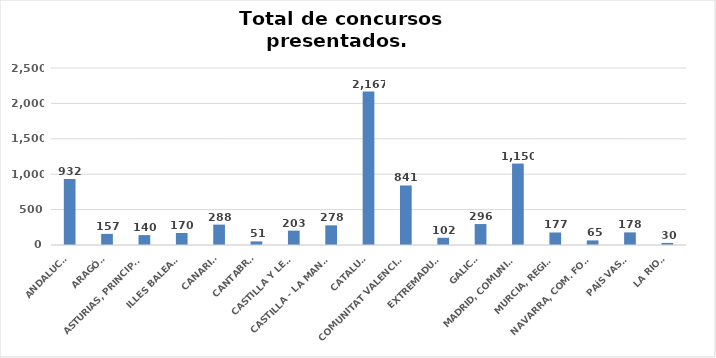
| Category | Series 0 |
|---|---|
| ANDALUCÍA | 932 |
| ARAGÓN | 157 |
| ASTURIAS, PRINCIPADO | 140 |
| ILLES BALEARS | 170 |
| CANARIAS | 288 |
| CANTABRIA | 51 |
| CASTILLA Y LEÓN | 203 |
| CASTILLA - LA MANCHA | 278 |
| CATALUÑA | 2167 |
| COMUNITAT VALENCIANA | 841 |
| EXTREMADURA | 102 |
| GALICIA | 296 |
| MADRID, COMUNIDAD | 1150 |
| MURCIA, REGIÓN | 177 |
| NAVARRA, COM. FORAL | 65 |
| PAÍS VASCO | 178 |
| LA RIOJA | 30 |